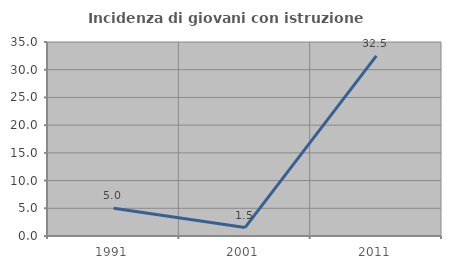
| Category | Incidenza di giovani con istruzione universitaria |
|---|---|
| 1991.0 | 5 |
| 2001.0 | 1.515 |
| 2011.0 | 32.5 |